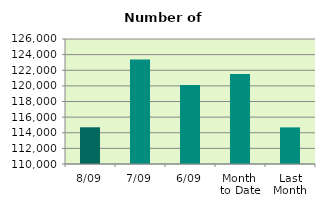
| Category | Series 0 |
|---|---|
| 8/09 | 114698 |
| 7/09 | 123374 |
| 6/09 | 120108 |
| Month 
to Date | 121513.667 |
| Last
Month | 114688 |